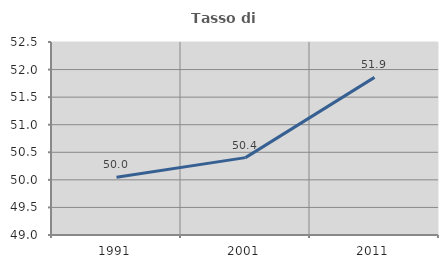
| Category | Tasso di occupazione   |
|---|---|
| 1991.0 | 50.046 |
| 2001.0 | 50.403 |
| 2011.0 | 51.859 |